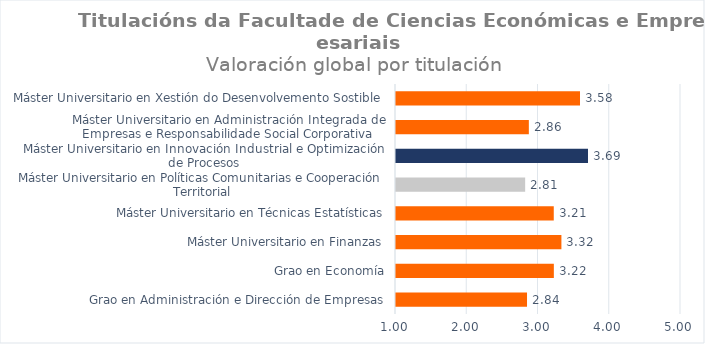
| Category | Series 0 |
|---|---|
| Grao en Administración e Dirección de Empresas | 2.839 |
| Grao en Economía | 3.215 |
| Máster Universitario en Finanzas | 3.322 |
| Máster Universitario en Técnicas Estatísticas | 3.214 |
| Máster Universitario en Políticas Comunitarias e Cooperación Territorial | 2.813 |
| Máster Universitario en Innovación Industrial e Optimización de Procesos | 3.695 |
| Máster Universitario en Administración Integrada de Empresas e Responsabilidade Social Corporativa | 2.864 |
| Máster Universitario en Xestión do Desenvolvemento Sostible | 3.583 |